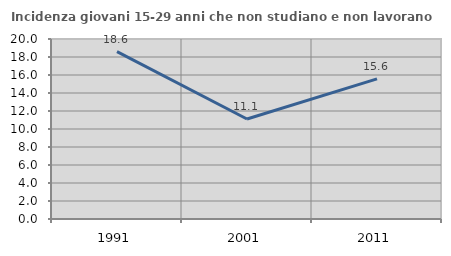
| Category | Incidenza giovani 15-29 anni che non studiano e non lavorano  |
|---|---|
| 1991.0 | 18.599 |
| 2001.0 | 11.111 |
| 2011.0 | 15.574 |